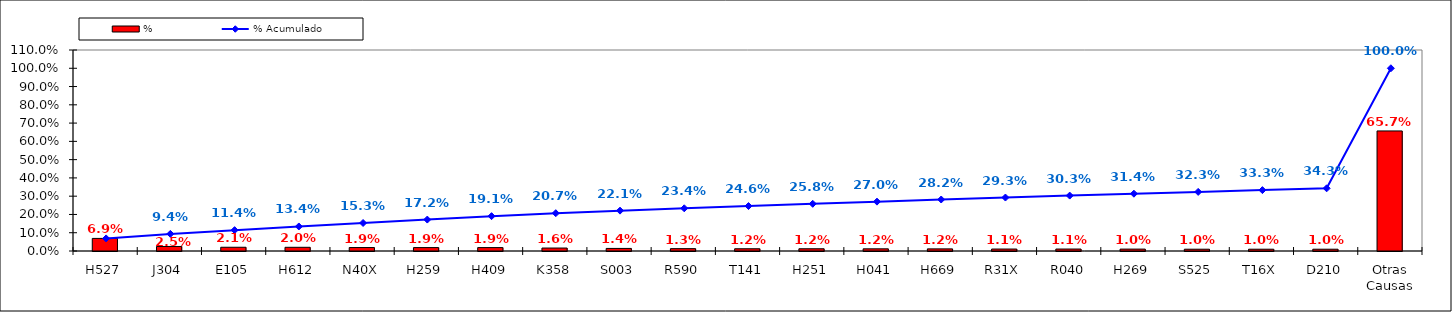
| Category | % |
|---|---|
| H527 | 0.069 |
| J304 | 0.025 |
| E105 | 0.021 |
| H612 | 0.02 |
| N40X | 0.019 |
| H259 | 0.019 |
| H409 | 0.019 |
| K358 | 0.016 |
| S003 | 0.014 |
| R590 | 0.013 |
| T141 | 0.012 |
| H251 | 0.012 |
| H041 | 0.012 |
| H669 | 0.012 |
| R31X | 0.011 |
| R040 | 0.011 |
| H269 | 0.01 |
| S525 | 0.01 |
| T16X | 0.01 |
| D210 | 0.01 |
| Otras Causas | 0.657 |